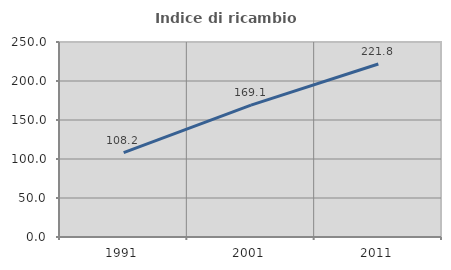
| Category | Indice di ricambio occupazionale  |
|---|---|
| 1991.0 | 108.179 |
| 2001.0 | 169.084 |
| 2011.0 | 221.754 |